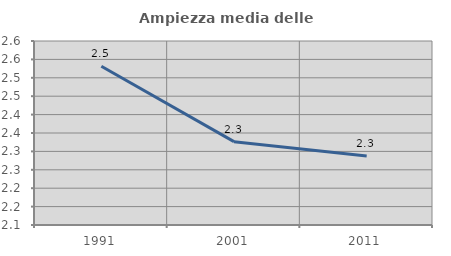
| Category | Ampiezza media delle famiglie |
|---|---|
| 1991.0 | 2.532 |
| 2001.0 | 2.327 |
| 2011.0 | 2.287 |